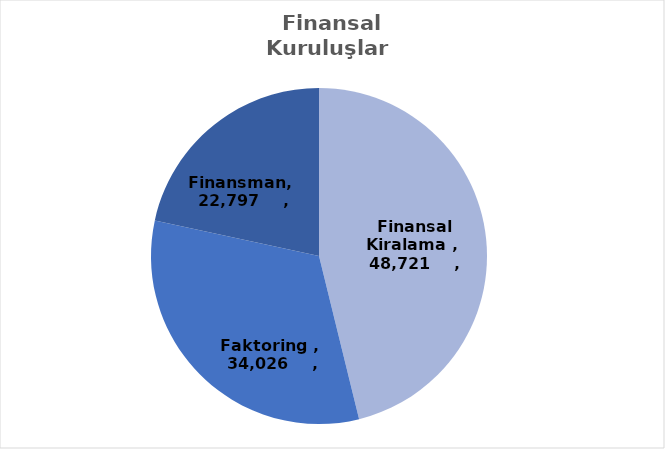
| Category | Series 0 |
|---|---|
| Finansal Kiralama  | 48721 |
| Faktoring  | 34026 |
| Finansman | 22797 |